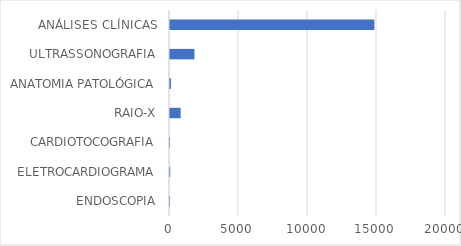
| Category | Series 0 |
|---|---|
| ENDOSCOPIA | 2 |
| ELETROCARDIOGRAMA | 19 |
| CARDIOTOCOGRAFIA | 2 |
| RAIO-X | 773 |
| ANATOMIA PATOLÓGICA | 74 |
| ULTRASSONOGRAFIA | 1774 |
| ANÁLISES CLÍNICAS | 14810 |